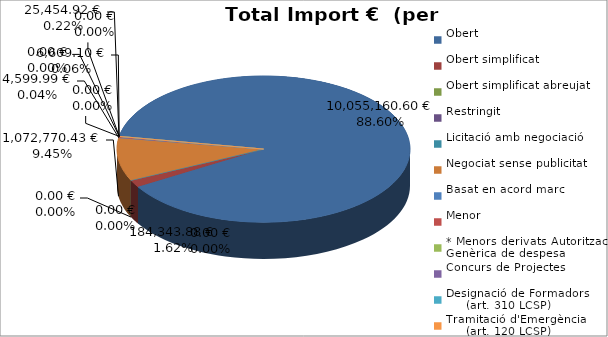
| Category | Total preu
(amb IVA) |
|---|---|
| Obert | 10055160.6 |
| Obert simplificat | 184343.88 |
| Obert simplificat abreujat | 0 |
| Restringit | 0 |
| Licitació amb negociació | 0 |
| Negociat sense publicitat | 1072770.43 |
| Basat en acord marc | 4599.99 |
| Menor | 25454.92 |
| * Menors derivats Autorització Genèrica de despesa | 6609.1 |
| Concurs de Projectes | 0 |
| Designació de Formadors
     (art. 310 LCSP) | 0 |
| Tramitació d'Emergència
     (art. 120 LCSP) | 0 |